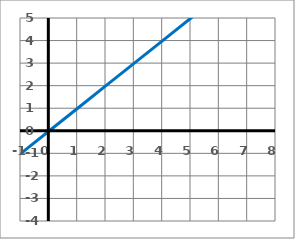
| Category | y |
|---|---|
| -1.0 | -1 |
| 0.0 | 0 |
| 1.0 | 1 |
| 2.0 | 2 |
| 3.0 | 3 |
| 4.0 | 4 |
| 5.0 | 5 |
| 6.0 | 6 |
| 7.0 | 7 |
| 8.0 | 8 |